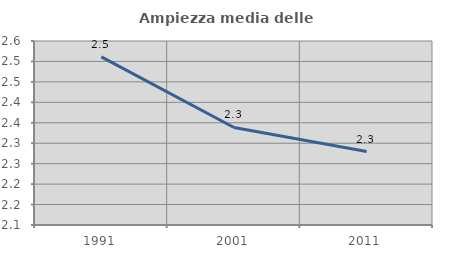
| Category | Ampiezza media delle famiglie |
|---|---|
| 1991.0 | 2.511 |
| 2001.0 | 2.338 |
| 2011.0 | 2.28 |